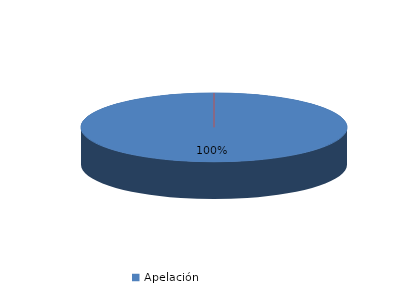
| Category | Series 0 |
|---|---|
| Apelación | 25 |
| Casación | 0 |